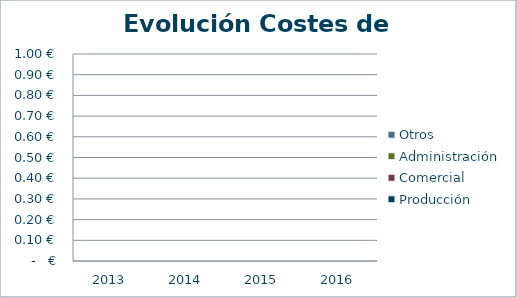
| Category | Producción | Comercial | Administración | Otros |
|---|---|---|---|---|
| 2013.0 | 0 | 0 | 0 | 0 |
| 2014.0 | 0 | 0 | 0 | 0 |
| 2015.0 | 0 | 0 | 0 | 0 |
| 2016.0 | 0 | 0 | 0 | 0 |